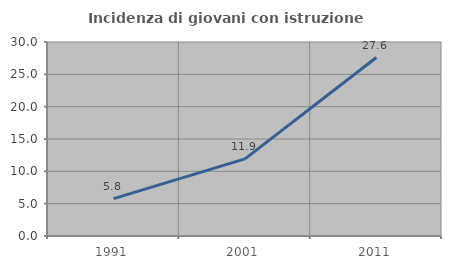
| Category | Incidenza di giovani con istruzione universitaria |
|---|---|
| 1991.0 | 5.782 |
| 2001.0 | 11.92 |
| 2011.0 | 27.602 |